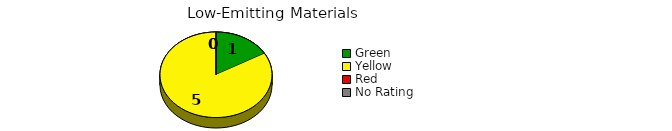
| Category | Counts |
|---|---|
| Green | 1 |
| Yellow | 5 |
| Red | 0 |
| No Rating | 0 |